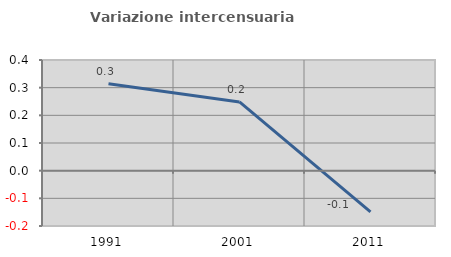
| Category | Variazione intercensuaria annua |
|---|---|
| 1991.0 | 0.314 |
| 2001.0 | 0.248 |
| 2011.0 | -0.149 |